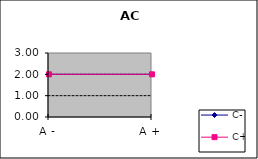
| Category | C- | C+ |
|---|---|---|
| A - | 2 | 2 |
| A + | 2 | 2 |